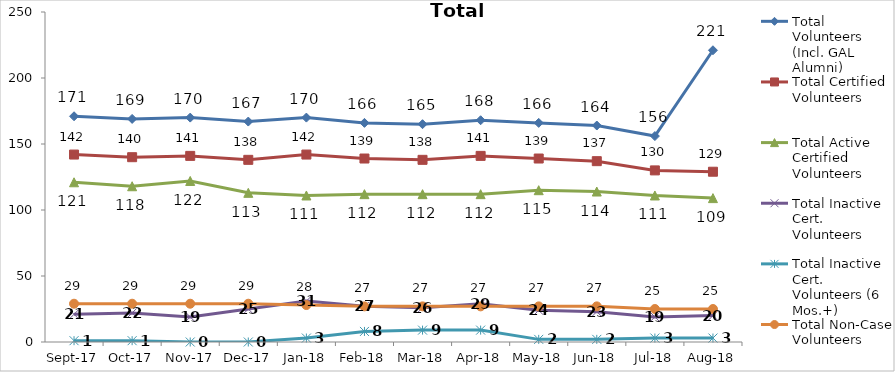
| Category | Total Volunteers (Incl. GAL Alumni) | Total Certified Volunteers | Total Active Certified Volunteers | Total Inactive Cert. Volunteers | Total Inactive Cert. Volunteers (6 Mos.+) | Total Non-Case Volunteers |
|---|---|---|---|---|---|---|
| 2017-09-01 | 171 | 142 | 121 | 21 | 1 | 29 |
| 2017-10-01 | 169 | 140 | 118 | 22 | 1 | 29 |
| 2017-11-01 | 170 | 141 | 122 | 19 | 0 | 29 |
| 2017-12-01 | 167 | 138 | 113 | 25 | 0 | 29 |
| 2018-01-01 | 170 | 142 | 111 | 31 | 3 | 28 |
| 2018-02-01 | 166 | 139 | 112 | 27 | 8 | 27 |
| 2018-03-01 | 165 | 138 | 112 | 26 | 9 | 27 |
| 2018-04-01 | 168 | 141 | 112 | 29 | 9 | 27 |
| 2018-05-01 | 166 | 139 | 115 | 24 | 2 | 27 |
| 2018-06-01 | 164 | 137 | 114 | 23 | 2 | 27 |
| 2018-07-01 | 156 | 130 | 111 | 19 | 3 | 25 |
| 2018-08-01 | 221 | 129 | 109 | 20 | 3 | 25 |